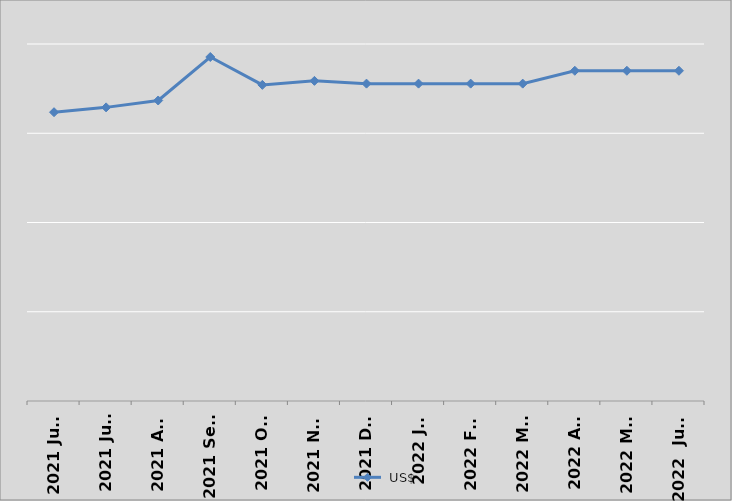
| Category |  US$ |
|---|---|
| 2021 June | 1617.9 |
| 2021 July | 1645 |
| 2021 Aug | 1683.5 |
| 2021 Sept | 1927.1 |
| 2021 Oct | 1771 |
| 2021 Nov | 1793.5 |
| 2021 Dec | 1778 |
| 2022 Jan | 1778 |
| 2022 Feb | 1778 |
| 2022 Mar | 1778 |
| 2022 Apr | 1850 |
| 2022 May | 1850 |
| 2022  June | 1850 |